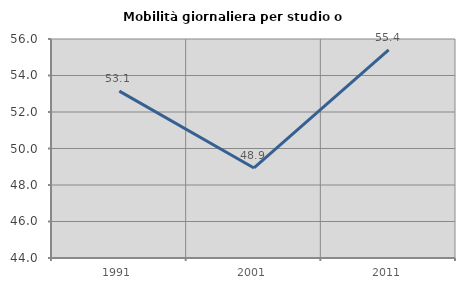
| Category | Mobilità giornaliera per studio o lavoro |
|---|---|
| 1991.0 | 53.145 |
| 2001.0 | 48.934 |
| 2011.0 | 55.407 |